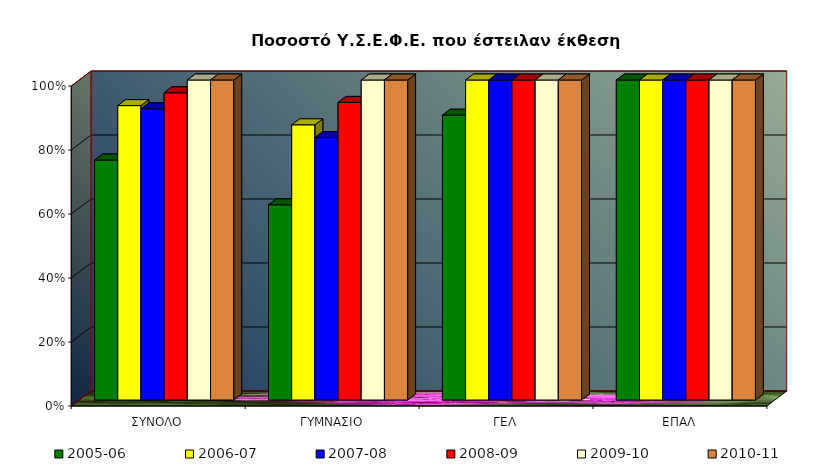
| Category | 2005-06 | 2006-07 | 2007-08 | 2008-09 | 2009-10 | 2010-11 |
|---|---|---|---|---|---|---|
| ΣΥΝΟΛΟ | 0.75 | 0.92 | 0.91 | 0.96 | 1 | 1 |
| ΓΥΜΝΑΣΙΟ | 0.61 | 0.86 | 0.82 | 0.93 | 1 | 1 |
| ΓΕΛ | 0.89 | 1 | 1 | 1 | 1 | 1 |
| ΕΠΑΛ | 1 | 1 | 1 | 1 | 1 | 1 |